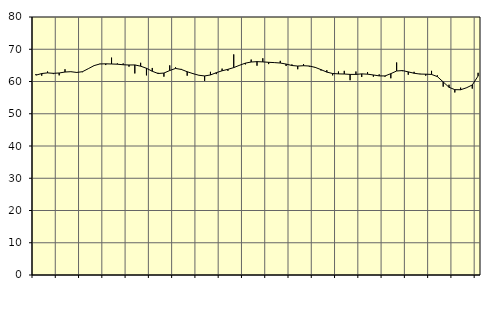
| Category | Piggar | Series 1 |
|---|---|---|
| nan | 62.3 | 61.97 |
| 1.0 | 61.8 | 62.47 |
| 1.0 | 63.1 | 62.67 |
| 1.0 | 62.3 | 62.53 |
| nan | 61.9 | 62.64 |
| 2.0 | 63.8 | 62.94 |
| 2.0 | 63 | 63.04 |
| 2.0 | 62.7 | 62.81 |
| nan | 62.9 | 63.04 |
| 3.0 | 64 | 63.97 |
| 3.0 | 64.9 | 64.93 |
| 3.0 | 65.5 | 65.44 |
| nan | 65.1 | 65.48 |
| 4.0 | 67.4 | 65.43 |
| 4.0 | 65.6 | 65.36 |
| 4.0 | 65.6 | 65.19 |
| nan | 64.6 | 65.12 |
| 5.0 | 62.5 | 65.14 |
| 5.0 | 65.8 | 64.75 |
| 5.0 | 61.9 | 64.1 |
| nan | 64.2 | 63.17 |
| 6.0 | 62.7 | 62.48 |
| 6.0 | 61.5 | 62.62 |
| 6.0 | 65 | 63.4 |
| nan | 64.4 | 64.05 |
| 7.0 | 63.9 | 63.74 |
| 7.0 | 61.8 | 63.03 |
| 7.0 | 62.5 | 62.44 |
| nan | 61.9 | 61.94 |
| 8.0 | 60.2 | 61.72 |
| 8.0 | 63 | 62.03 |
| 8.0 | 62.3 | 62.73 |
| nan | 64 | 63.32 |
| 9.0 | 63.3 | 63.77 |
| 9.0 | 68.4 | 64.31 |
| 9.0 | 65.1 | 65.03 |
| nan | 65.3 | 65.69 |
| 10.0 | 66.8 | 66.04 |
| 10.0 | 64.9 | 66.16 |
| 10.0 | 67.2 | 66.08 |
| nan | 65.4 | 65.95 |
| 11.0 | 65.9 | 65.86 |
| 11.0 | 66.4 | 65.73 |
| 11.0 | 64.8 | 65.41 |
| nan | 65.3 | 64.96 |
| 12.0 | 63.8 | 64.79 |
| 12.0 | 65.4 | 64.89 |
| 12.0 | 64.6 | 64.8 |
| nan | 64.5 | 64.38 |
| 13.0 | 63.4 | 63.68 |
| 13.0 | 63.5 | 62.91 |
| 13.0 | 61.9 | 62.48 |
| nan | 63.1 | 62.36 |
| 14.0 | 63.3 | 62.32 |
| 14.0 | 60.4 | 62.2 |
| 14.0 | 63.1 | 62.2 |
| nan | 61.4 | 62.36 |
| 15.0 | 62.9 | 62.27 |
| 15.0 | 61.5 | 62.03 |
| 15.0 | 62.2 | 61.74 |
| nan | 61.5 | 61.72 |
| 16.0 | 61 | 62.43 |
| 16.0 | 65.9 | 63.26 |
| 16.0 | 63.2 | 63.39 |
| nan | 62.1 | 62.98 |
| 17.0 | 63 | 62.56 |
| 17.0 | 62.4 | 62.31 |
| 17.0 | 61.8 | 62.27 |
| nan | 63.3 | 62.19 |
| 18.0 | 61.9 | 61.52 |
| 18.0 | 58.4 | 59.87 |
| 18.0 | 59 | 58.21 |
| nan | 56.6 | 57.47 |
| 19.0 | 58.1 | 57.44 |
| 19.0 | 58 | 58.05 |
| 19.0 | 57.8 | 58.92 |
| nan | 62.7 | 61.7 |